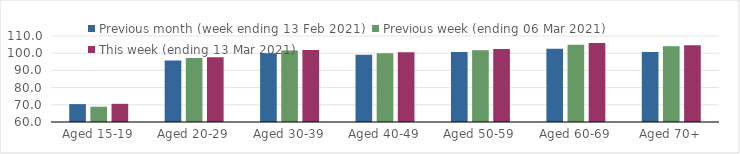
| Category | Previous month (week ending 13 Feb 2021) | Previous week (ending 06 Mar 2021) | This week (ending 13 Mar 2021) |
|---|---|---|---|
| Aged 15-19 | 70.4 | 68.89 | 70.57 |
| Aged 20-29 | 95.72 | 97.19 | 97.58 |
| Aged 30-39 | 99.97 | 101.6 | 101.93 |
| Aged 40-49 | 99.05 | 100.03 | 100.5 |
| Aged 50-59 | 100.76 | 101.69 | 102.47 |
| Aged 60-69 | 102.58 | 104.94 | 106 |
| Aged 70+ | 100.75 | 104.06 | 104.65 |